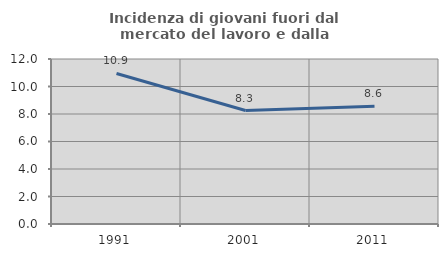
| Category | Incidenza di giovani fuori dal mercato del lavoro e dalla formazione  |
|---|---|
| 1991.0 | 10.948 |
| 2001.0 | 8.251 |
| 2011.0 | 8.564 |